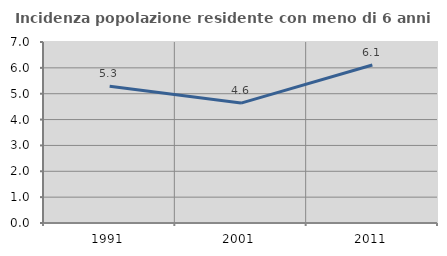
| Category | Incidenza popolazione residente con meno di 6 anni |
|---|---|
| 1991.0 | 5.288 |
| 2001.0 | 4.637 |
| 2011.0 | 6.112 |